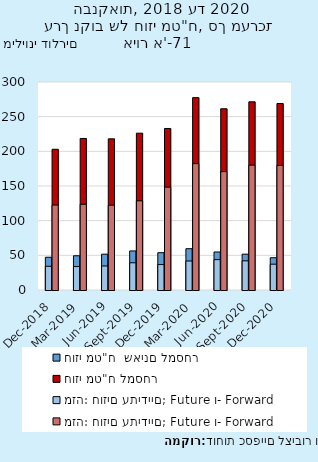
| Category | חוזי מט"ח  שאינם למסחר | חוזי מט"ח למסחר |
|---|---|---|
| 2018-12-31 | 47.257 | 202.952 |
| 2019-03-31 | 49.379 | 218.557 |
| 2019-06-30 | 51.667 | 217.975 |
| 2019-09-30 | 56.341 | 226.194 |
| 2019-12-31 | 53.816 | 232.973 |
| 2020-03-31 | 59.585 | 277.462 |
| 2020-06-30 | 54.827 | 261.386 |
| 2020-09-30 | 51.692 | 271.406 |
| 2020-12-31 | 46.515 | 268.994 |